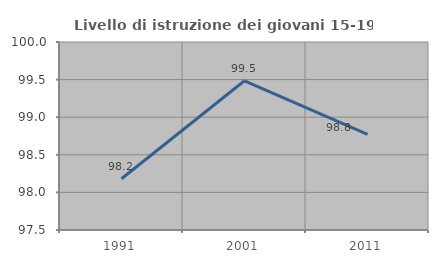
| Category | Livello di istruzione dei giovani 15-19 anni |
|---|---|
| 1991.0 | 98.182 |
| 2001.0 | 99.485 |
| 2011.0 | 98.773 |